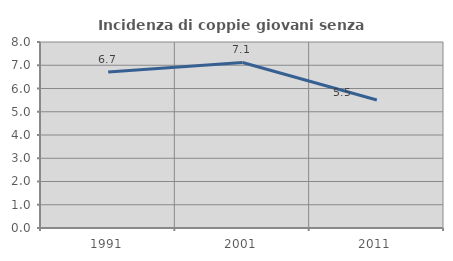
| Category | Incidenza di coppie giovani senza figli |
|---|---|
| 1991.0 | 6.707 |
| 2001.0 | 7.12 |
| 2011.0 | 5.506 |